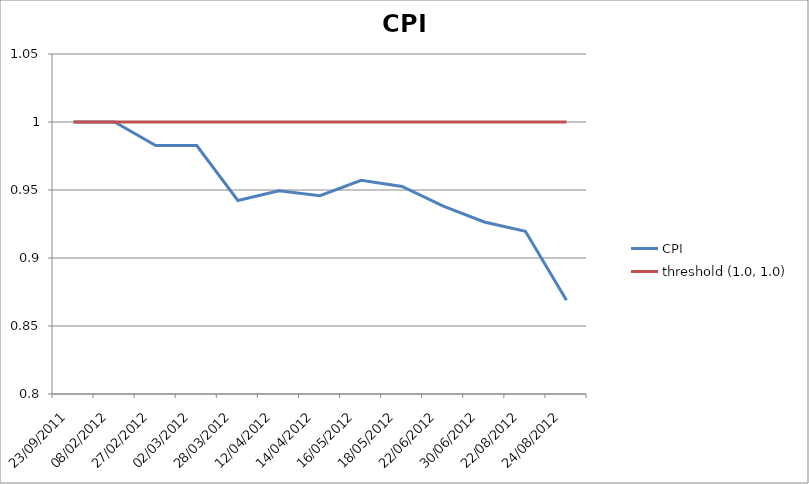
| Category | CPI | threshold (1.0, 1.0) |
|---|---|---|
| 23/09/2011 | 1 | 1 |
| 08/02/2012 | 1 | 1 |
| 27/02/2012 | 0.983 | 1 |
| 02/03/2012 | 0.983 | 1 |
| 28/03/2012 | 0.942 | 1 |
| 12/04/2012 | 0.949 | 1 |
| 14/04/2012 | 0.946 | 1 |
| 16/05/2012 | 0.957 | 1 |
| 18/05/2012 | 0.953 | 1 |
| 22/06/2012 | 0.938 | 1 |
| 30/06/2012 | 0.926 | 1 |
| 22/08/2012 | 0.92 | 1 |
| 24/08/2012 | 0.869 | 1 |